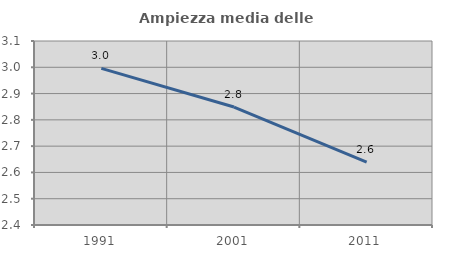
| Category | Ampiezza media delle famiglie |
|---|---|
| 1991.0 | 2.996 |
| 2001.0 | 2.849 |
| 2011.0 | 2.64 |